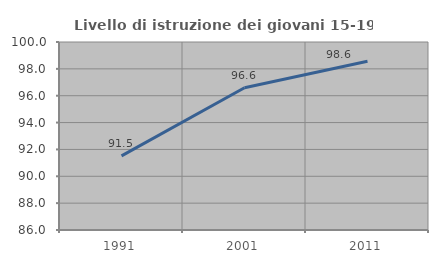
| Category | Livello di istruzione dei giovani 15-19 anni |
|---|---|
| 1991.0 | 91.519 |
| 2001.0 | 96.591 |
| 2011.0 | 98.561 |